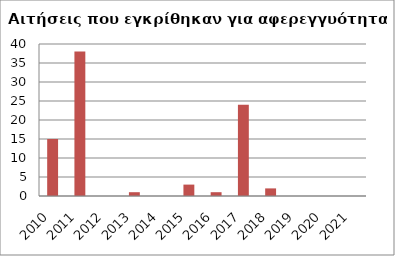
| Category | Series 1 |
|---|---|
| 2010.0 | 15 |
| 2011.0 | 38 |
| 2012.0 | 0 |
| 2013.0 | 1 |
| 2014.0 | 0 |
| 2015.0 | 3 |
| 2016.0 | 1 |
| 2017.0 | 24 |
| 2018.0 | 2 |
| 2019.0 | 0 |
| 2020.0 | 0 |
| 2021.0 | 0 |